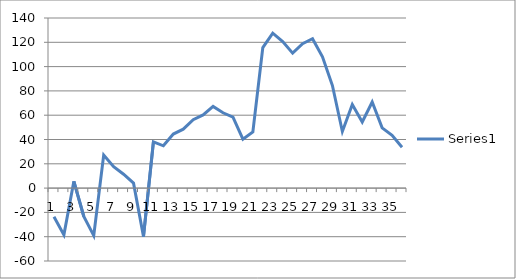
| Category | Series 0 |
|---|---|
| 0 | -23.6 |
| 1 | -38.5 |
| 2 | 5.6 |
| 3 | -23.4 |
| 4 | -39.1 |
| 5 | 27.2 |
| 6 | 17.6 |
| 7 | 11.4 |
| 8 | 4.1 |
| 9 | -39.9 |
| 10 | 38 |
| 11 | 34.8 |
| 12 | 44.5 |
| 13 | 48.5 |
| 14 | 56.3 |
| 15 | 60.2 |
| 16 | 67.2 |
| 17 | 62 |
| 18 | 58.4 |
| 19 | 40.3 |
| 20 | 46.3 |
| 21 | 115.6 |
| 22 | 127.5 |
| 23 | 120.6 |
| 24 | 111.1 |
| 25 | 118.9 |
| 26 | 122.9 |
| 27 | 108 |
| 28 | 84.4 |
| 29 | 46.6 |
| 30 | 68.8 |
| 31 | 54.4 |
| 32 | 70.8 |
| 33 | 49.6 |
| 34 | 43.4 |
| 35 | 33.6 |